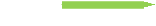
| Category | Supports collaboration and business process automation |
|---|---|
| Supports collaboration and business process automation | 3 |